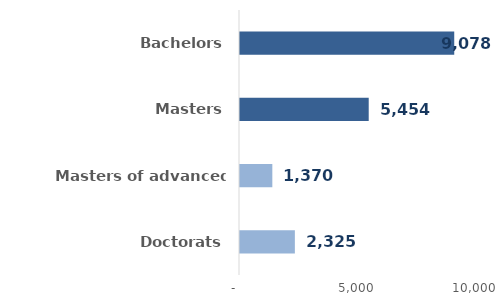
| Category | Series 0 |
|---|---|
| Doctorats | 2325 |
| Masters of advanced studies | 1370 |
| Masters | 5454 |
| Bachelors | 9078 |